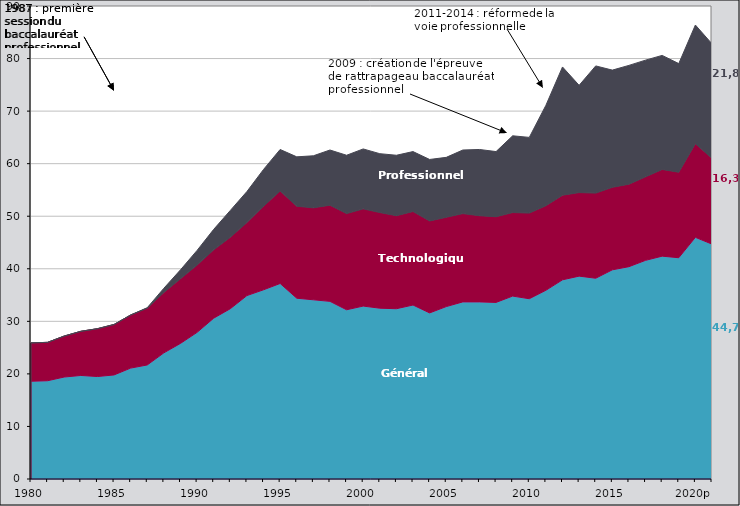
| Category | Général | Technologique | Professionnel |
|---|---|---|---|
| 1980 | 18.6 | 7.3 | 0 |
| 1981 | 18.7 | 7.3 | 0 |
| 1982 | 19.4 | 7.8 | 0 |
| 1983 | 19.7 | 8.4 | 0 |
| 1984 | 19.5 | 9.1 | 0 |
| 1985 | 19.8 | 9.6 | 0 |
| 1986 | 21.1 | 10.1 | 0 |
| 1987 | 21.7 | 10.8 | 0.1 |
| 1988 | 24 | 11.5 | 0.8 |
| 1989 | 25.8 | 12.3 | 1.7 |
| 1990 | 27.9 | 12.8 | 2.8 |
| 1991 | 30.6 | 13 | 3.9 |
| 1992 | 32.4 | 13.6 | 5.1 |
| 1993 | 34.9 | 13.9 | 5.9 |
| 1994 | 36 | 15.9 | 7 |
| 1995 | 37.2 | 17.6 | 7.9 |
| 1996 | 34.4 | 17.5 | 9.4 |
| 1997 | 34.1 | 17.5 | 9.9 |
| 1998 | 33.8 | 18.3 | 10.5 |
| 1999 | 32.2 | 18.3 | 11.1 |
| 2000 | 32.9 | 18.5 | 11.4 |
| 2001 | 32.5 | 18.2 | 11.2 |
| 2002 | 32.4 | 17.7 | 11.5 |
| 2003 | 33.1 | 17.8 | 11.4 |
| 2004 | 31.6 | 17.5 | 11.7 |
| 2005 | 32.8 | 17 | 11.4 |
| 2006 | 33.7 | 16.8 | 12.1 |
| 2007 | 33.7 | 16.4 | 12.6 |
| 2008 | 33.6 | 16.3 | 12.4 |
| 2009 | 34.8 | 15.9 | 14.6 |
| 2010 | 34.3 | 16.3 | 14.4 |
| 2011 | 35.9 | 16.1 | 19.1 |
| 2012 | 37.9 | 16.1 | 24.4 |
| 2013 | 38.6 | 15.9 | 20.4 |
| 2014 | 38.2 | 16.2 | 24.2 |
| 2015 | 39.8 | 15.7 | 22.3 |
| 2016 | 40.4 | 15.7 | 22.6 |
| 2017 | 41.6 | 15.9 | 22.2 |
| 2018 | 42.4 | 16.5 | 21.7 |
| 2019 | 42.1 | 16.27 | 20.67 |
| 2020p | 45.98 | 17.83 | 22.57 |
| 2021p | 44.69 | 16.33 | 21.78 |